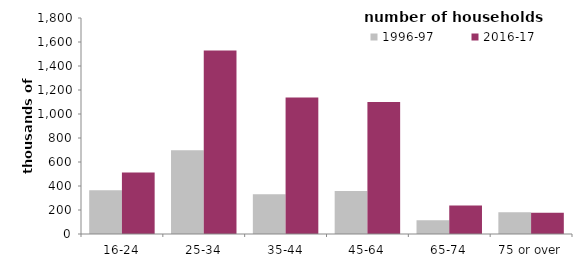
| Category | 1996-97 | 2016-17 |
|---|---|---|
| 16-24 | 364.852 | 512.752 |
| 25-34 | 697.111 | 1528.764 |
| 35-44 | 331.121 | 1136.804 |
| 45-64 | 357.489 | 1099.517 |
| 65-74 | 114.346 | 237.608 |
| 75 or over | 182.261 | 176.623 |